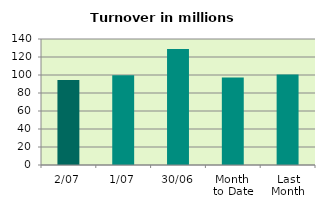
| Category | Series 0 |
|---|---|
| 2/07 | 94.401 |
| 1/07 | 99.854 |
| 30/06 | 128.908 |
| Month 
to Date | 97.127 |
| Last
Month | 100.537 |